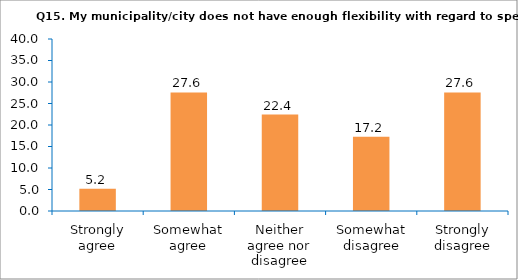
| Category | Series 0 |
|---|---|
| Strongly agree | 5.172 |
| Somewhat agree | 27.586 |
| Neither agree nor disagree | 22.414 |
| Somewhat disagree | 17.241 |
| Strongly disagree | 27.586 |